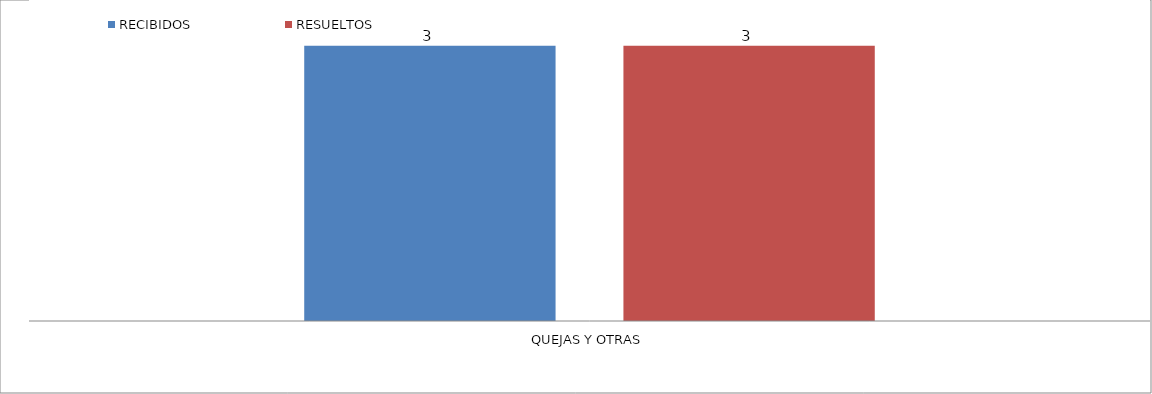
| Category | RECIBIDOS | RESUELTOS  |
|---|---|---|
| QUEJAS Y OTRAS | 3 | 3 |